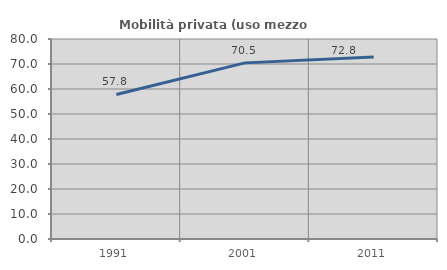
| Category | Mobilità privata (uso mezzo privato) |
|---|---|
| 1991.0 | 57.831 |
| 2001.0 | 70.45 |
| 2011.0 | 72.757 |